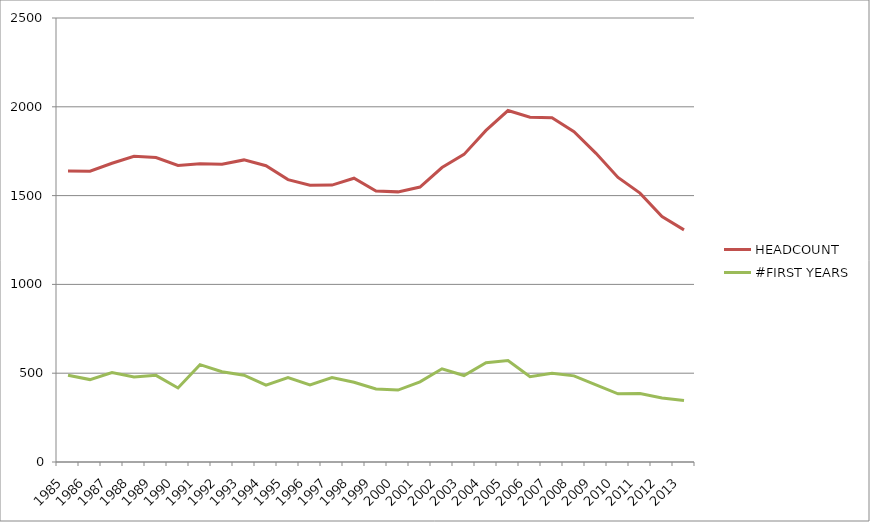
| Category | HEADCOUNT | #FIRST YEARS |
|---|---|---|
| 1985.0 | 1638 | 488 |
| 1986.0 | 1637 | 464 |
| 1987.0 | 1682 | 504 |
| 1988.0 | 1721 | 479 |
| 1989.0 | 1714 | 488 |
| 1990.0 | 1670 | 417 |
| 1991.0 | 1679 | 548 |
| 1992.0 | 1677 | 508 |
| 1993.0 | 1701 | 489 |
| 1994.0 | 1668 | 433 |
| 1995.0 | 1590 | 475 |
| 1996.0 | 1558 | 434 |
| 1997.0 | 1559 | 475 |
| 1998.0 | 1598 | 449 |
| 1999.0 | 1526 | 411 |
| 2000.0 | 1521 | 405 |
| 2001.0 | 1548 | 451 |
| 2002.0 | 1658 | 525 |
| 2003.0 | 1732 | 487 |
| 2004.0 | 1867 | 559 |
| 2005.0 | 1979 | 571 |
| 2006.0 | 1941 | 480 |
| 2007.0 | 1938 | 500 |
| 2008.0 | 1860 | 485 |
| 2009.0 | 1738 | 434 |
| 2010.0 | 1602 | 384 |
| 2011.0 | 1514 | 385 |
| 2012.0 | 1382 | 360 |
| 2013.0 | 1307 | 346 |